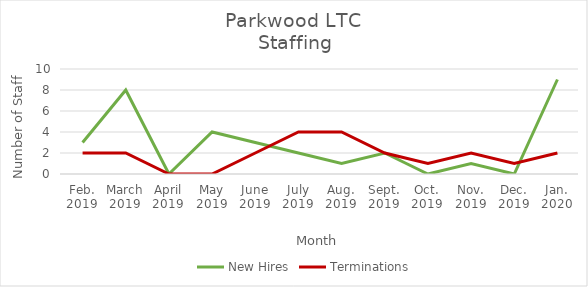
| Category | New Hires | Terminations |
|---|---|---|
| Feb.
2019 | 3 | 2 |
| March
2019 | 8 | 2 |
| April
2019 | 0 | 0 |
| May
2019 | 4 | 0 |
| June
2019 | 3 | 2 |
| July
2019 | 2 | 4 |
| Aug.
2019 | 1 | 4 |
| Sept.
2019 | 2 | 2 |
| Oct.
2019 | 0 | 1 |
| Nov.
2019 | 1 | 2 |
| Dec.
2019 | 0 | 1 |
| Jan.
2020 | 9 | 2 |